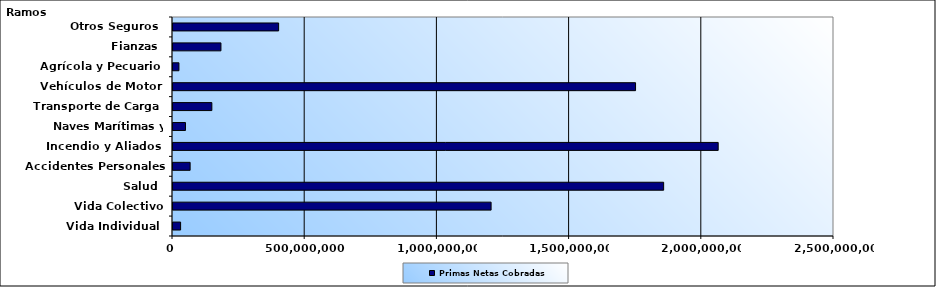
| Category | Primas Netas Cobradas |
|---|---|
| Vida Individual  | 28741023.01 |
| Vida Colectivo | 1203090339.32 |
| Salud  | 1855692901.59 |
| Accidentes Personales | 64776887.61 |
| Incendio y Aliados  | 2062022587.9 |
| Naves Marítimas y Aéreas  | 47162815.96 |
| Transporte de Carga  | 146946689.53 |
| Vehículos de Motor  | 1749475365.35 |
| Agrícola y Pecuario  | 22444431.26 |
| Fianzas  | 181336854.54 |
| Otros Seguros  | 399516853.61 |